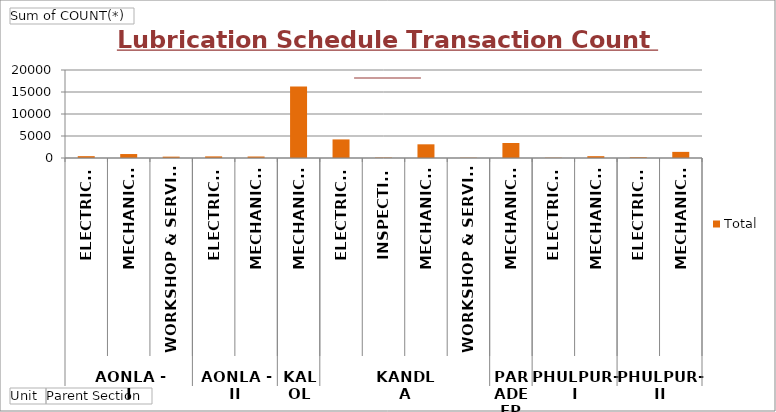
| Category | Total |
|---|---|
| 0 | 421 |
| 1 | 900 |
| 2 | 308 |
| 3 | 366 |
| 4 | 339 |
| 5 | 16253 |
| 6 | 4222 |
| 7 | 87 |
| 8 | 3111 |
| 9 | 59 |
| 10 | 3413 |
| 11 | 61 |
| 12 | 417 |
| 13 | 174 |
| 14 | 1393 |